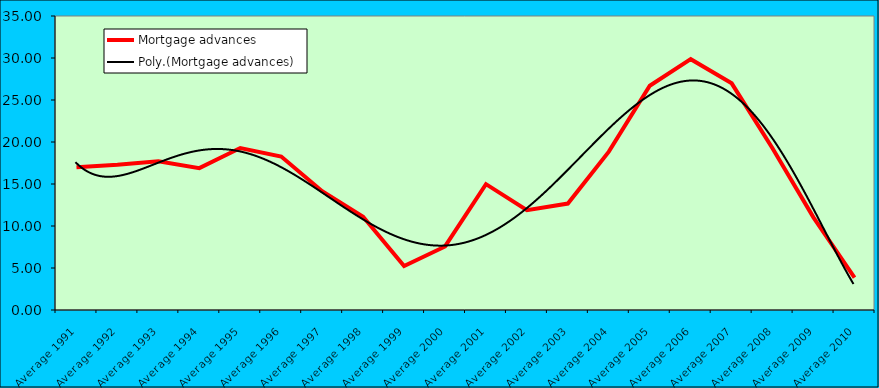
| Category | Mortgage advances |
|---|---|
| Average 1991 | 17.008 |
| Average 1992 | 17.288 |
| Average 1993 | 17.715 |
| Average 1994 | 16.887 |
| Average 1995 | 19.283 |
| Average 1996 | 18.264 |
| Average 1997 | 14.145 |
| Average 1998 | 11.109 |
| Average 1999 | 5.238 |
| Average 2000 | 7.564 |
| Average 2001 | 14.984 |
| Average 2002 | 11.888 |
| Average 2003 | 12.668 |
| Average 2004 | 18.854 |
| Average 2005 | 26.699 |
| Average 2006 | 29.863 |
| Average 2007 | 26.982 |
| Average 2008 | 19.234 |
| Average 2009 | 10.996 |
| Average 2010 | 3.844 |